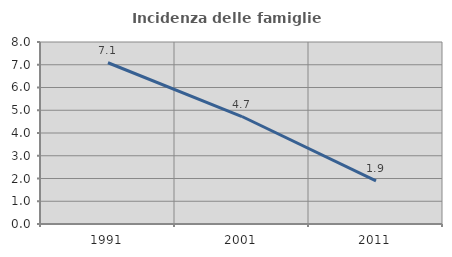
| Category | Incidenza delle famiglie numerose |
|---|---|
| 1991.0 | 7.088 |
| 2001.0 | 4.724 |
| 2011.0 | 1.897 |